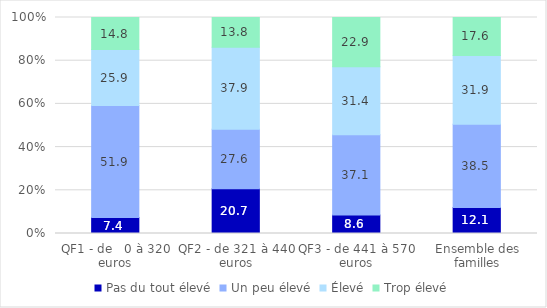
| Category | Pas du tout élevé | Un peu élevé | Élevé | Trop élevé |
|---|---|---|---|---|
| QF1 - de   0 à 320 euros | 7.407 | 51.852 | 25.926 | 14.815 |
| QF2 - de 321 à 440 euros | 20.69 | 27.586 | 37.931 | 13.793 |
| QF3 - de 441 à 570 euros | 8.571 | 37.143 | 31.429 | 22.857 |
| Ensemble des familles | 12.088 | 38.462 | 31.868 | 17.582 |